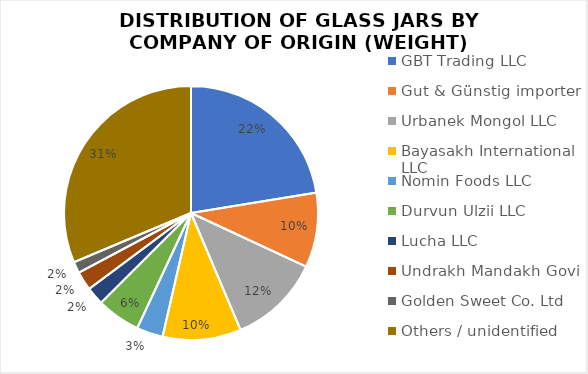
| Category | Series 0 |
|---|---|
| GBT Trading LLC | 40.96 |
| Gut & Günstig importer | 17.36 |
| Urbanek Mongol LLC | 21.35 |
| Bayasakh International LLC | 18.22 |
| Nomin Foods LLC | 6.12 |
| Durvun Ulzii LLC | 10.17 |
| Lucha LLC | 4.18 |
| Undrakh Mandakh Govi | 4.4 |
| Golden Sweet Co. Ltd | 2.64 |
| Others / unidentified | 57.23 |